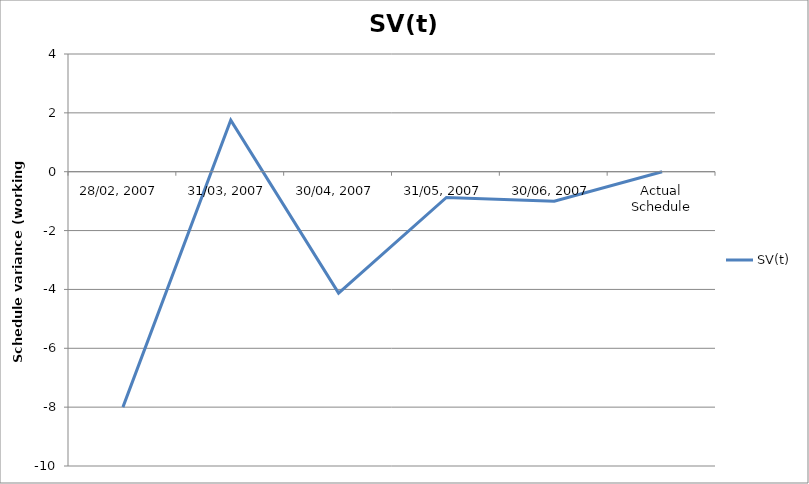
| Category | SV(t) |
|---|---|
| 28/02, 2007 | -8 |
| 31/03, 2007 | 1.75 |
| 30/04, 2007 | -4.125 |
| 31/05, 2007 | -0.875 |
| 30/06, 2007 | -1 |
| Actual Schedule | 0 |